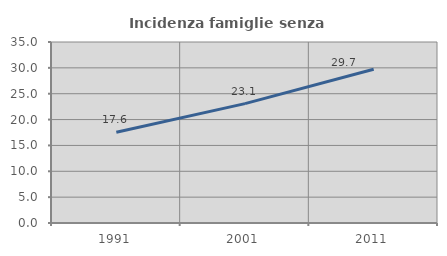
| Category | Incidenza famiglie senza nuclei |
|---|---|
| 1991.0 | 17.565 |
| 2001.0 | 23.09 |
| 2011.0 | 29.718 |